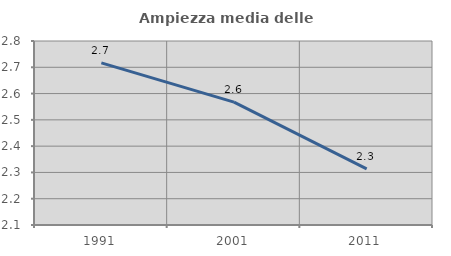
| Category | Ampiezza media delle famiglie |
|---|---|
| 1991.0 | 2.717 |
| 2001.0 | 2.567 |
| 2011.0 | 2.313 |